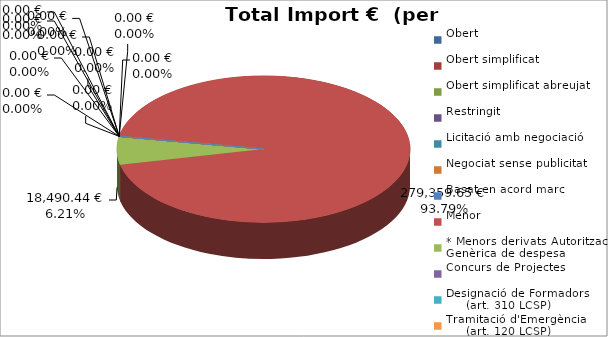
| Category | Total preu
(amb IVA) |
|---|---|
| Obert | 0 |
| Obert simplificat | 0 |
| Obert simplificat abreujat | 0 |
| Restringit | 0 |
| Licitació amb negociació | 0 |
| Negociat sense publicitat | 0 |
| Basat en acord marc | 0 |
| Menor | 279359.65 |
| * Menors derivats Autorització Genèrica de despesa | 18490.44 |
| Concurs de Projectes | 0 |
| Designació de Formadors
     (art. 310 LCSP) | 0 |
| Tramitació d'Emergència
     (art. 120 LCSP) | 0 |